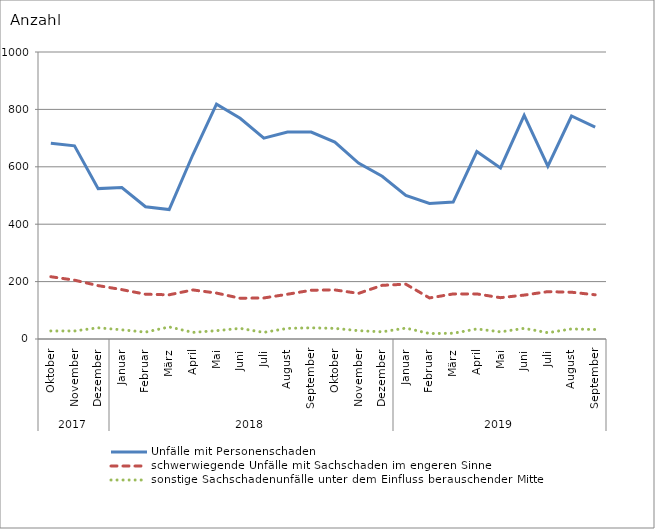
| Category | Unfälle mit Personenschaden | schwerwiegende Unfälle mit Sachschaden im engeren Sinne | sonstige Sachschadenunfälle unter dem Einfluss berauschender Mittel |
|---|---|---|---|
| 0 | 682 | 217 | 28 |
| 1 | 673 | 205 | 28 |
| 2 | 524 | 186 | 39 |
| 3 | 528 | 172 | 32 |
| 4 | 461 | 156 | 24 |
| 5 | 451 | 154 | 42 |
| 6 | 642 | 171 | 23 |
| 7 | 818 | 160 | 29 |
| 8 | 769 | 142 | 37 |
| 9 | 700 | 143 | 23 |
| 10 | 721 | 156 | 37 |
| 11 | 721 | 170 | 39 |
| 12 | 686 | 171 | 37 |
| 13 | 613 | 159 | 29 |
| 14 | 567 | 187 | 25 |
| 15 | 500 | 191 | 38 |
| 16 | 472 | 143 | 19 |
| 17 | 477 | 157 | 20 |
| 18 | 653 | 157 | 35 |
| 19 | 596 | 144 | 25 |
| 20 | 779 | 153 | 37 |
| 21 | 602 | 165 | 22 |
| 22 | 777 | 163 | 35 |
| 23 | 738 | 154 | 33 |